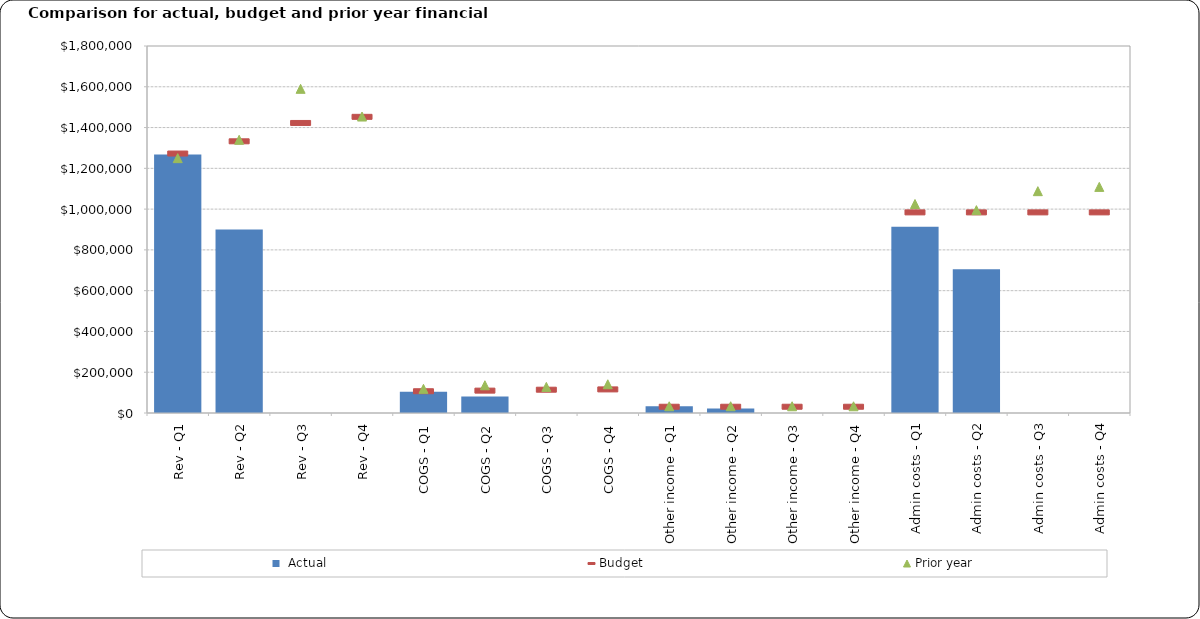
| Category | Actual |
|---|---|
| Rev - Q1 | 1268000 |
| Rev - Q2 | 900000 |
| Rev - Q3 | 0 |
| Rev - Q4 | 0 |
| COGS - Q1 | 104550 |
| COGS - Q2 | 81500 |
| COGS - Q3 | 0 |
| COGS - Q4 | 0 |
| Other income - Q1 | 33000 |
| Other income - Q2 | 22000 |
| Other income - Q3 | 0 |
| Other income - Q4 | 0 |
| Admin costs - Q1 | 914000 |
| Admin costs - Q2 | 705000 |
| Admin costs - Q3 | 0 |
| Admin costs - Q4 | 0 |